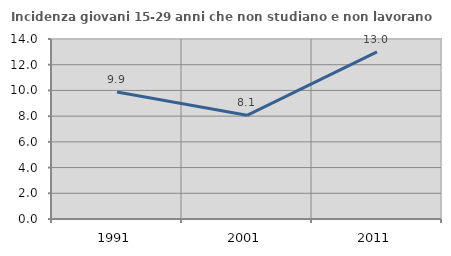
| Category | Incidenza giovani 15-29 anni che non studiano e non lavorano  |
|---|---|
| 1991.0 | 9.87 |
| 2001.0 | 8.065 |
| 2011.0 | 13.002 |